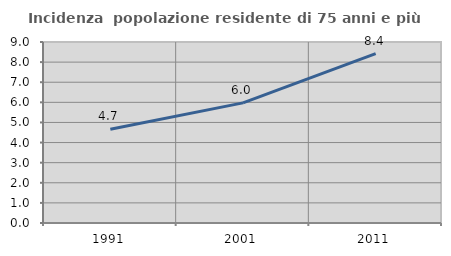
| Category | Incidenza  popolazione residente di 75 anni e più |
|---|---|
| 1991.0 | 4.661 |
| 2001.0 | 5.973 |
| 2011.0 | 8.419 |